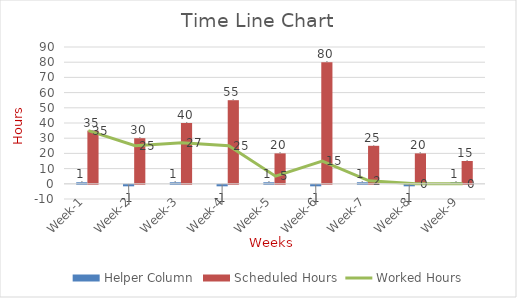
| Category | Helper Column | Scheduled Hours |
|---|---|---|
| Week-1 | 1 | 35 |
| Week-2 | -1 | 30 |
| Week-3 | 1 | 40 |
| Week-4 | -1 | 55 |
| Week-5 | 1 | 20 |
| Week-6 | -1 | 80 |
| Week-7 | 1 | 25 |
| Week-8 | -1 | 20 |
| Week-9 | 1 | 15 |